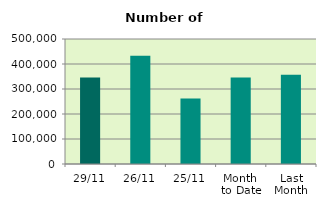
| Category | Series 0 |
|---|---|
| 29/11 | 346194 |
| 26/11 | 432612 |
| 25/11 | 262192 |
| Month 
to Date | 346386.476 |
| Last
Month | 357160.667 |